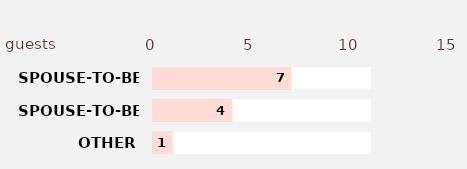
| Category | Series 2 | Series 3 | Series 1 | Series 0 |
|---|---|---|---|---|
| OTHER | 11 | 1 | 11 | 1 |
| SPOUSE-TO-BE 2 | 11 | 4 | 11 | 4 |
| SPOUSE-TO-BE 1 | 11 | 7 | 11 | 7 |